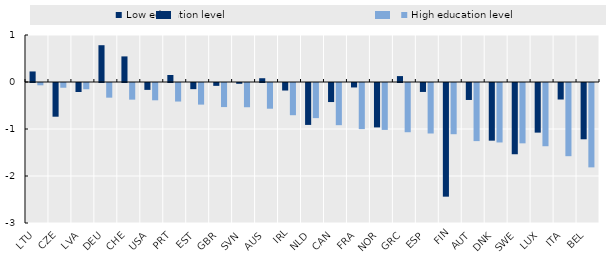
| Category | Low education level | High education level |
|---|---|---|
| LTU | 0.224 | -0.049 |
| CZE | -0.717 | -0.101 |
| LVA | -0.191 | -0.133 |
| DEU | 0.783 | -0.312 |
| CHE | 0.545 | -0.354 |
| USA | -0.146 | -0.368 |
| PRT | 0.149 | -0.394 |
| EST | -0.131 | -0.46 |
| GBR | -0.061 | -0.512 |
| SVN | -0.017 | -0.516 |
| AUS | 0.08 | -0.547 |
| IRL | -0.16 | -0.685 |
| NLD | -0.892 | -0.747 |
| CAN | -0.405 | -0.897 |
| FRA | -0.095 | -0.981 |
| NOR | -0.945 | -0.998 |
| GRC | 0.126 | -1.047 |
| ESP | -0.19 | -1.074 |
| FIN | -2.418 | -1.09 |
| AUT | -0.361 | -1.236 |
| DNK | -1.227 | -1.265 |
| SWE | -1.516 | -1.284 |
| LUX | -1.056 | -1.345 |
| ITA | -0.351 | -1.557 |
| BEL | -1.198 | -1.795 |